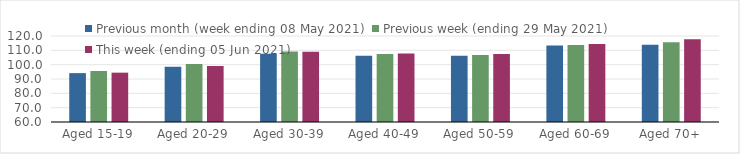
| Category | Previous month (week ending 08 May 2021) | Previous week (ending 29 May 2021) | This week (ending 05 Jun 2021) |
|---|---|---|---|
| Aged 15-19 | 94.1 | 95.61 | 94.42 |
| Aged 20-29 | 98.51 | 100.4 | 99.1 |
| Aged 30-39 | 107.68 | 109.22 | 108.95 |
| Aged 40-49 | 106.18 | 107.5 | 107.8 |
| Aged 50-59 | 106.24 | 106.81 | 107.39 |
| Aged 60-69 | 113.43 | 113.77 | 114.37 |
| Aged 70+ | 113.87 | 115.64 | 117.67 |